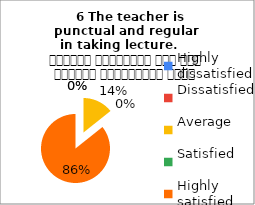
| Category |    6 The teacher is 
punctual and regular  in taking lecture.     शिक्षक समयनिष्ठ हैं एवं नियमित व्याख्यान देते हैं |
|---|---|
| Highly dissatisfied | 0 |
| Dissatisfied | 0 |
| Average | 2 |
| Satisfied | 0 |
| Highly satisfied | 12 |